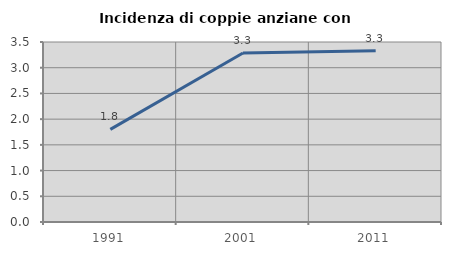
| Category | Incidenza di coppie anziane con figli |
|---|---|
| 1991.0 | 1.8 |
| 2001.0 | 3.286 |
| 2011.0 | 3.329 |